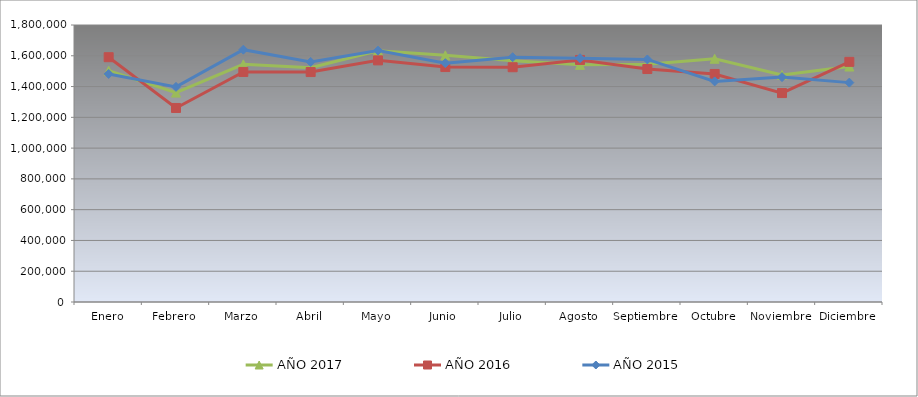
| Category | AÑO 2017 | AÑO 2016 | AÑO 2015 |
|---|---|---|---|
| Enero | 1502780 | 1590760 | 1481990 |
| Febrero | 1360660 | 1260860 | 1397860 |
| Marzo | 1544260 | 1494900 | 1639650 |
| Abril | 1522005 | 1494200 | 1560070 |
| Mayo | 1632520 | 1570220 | 1633820 |
| Junio | 1602860 | 1526760 | 1551980 |
| Julio | 1567640 | 1525600 | 1590920 |
| Agosto | 1541081 | 1572880 | 1584260 |
| Septiembre | 1545400 | 1513840 | 1576190 |
| Octubre | 1580580 | 1481860 | 1433400 |
| Noviembre | 1475000 | 1357680 | 1461400 |
| Diciembre | 1530100 | 1560540 | 1425560 |